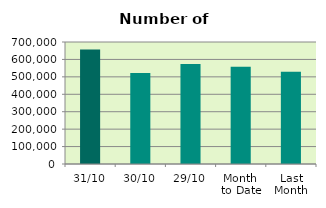
| Category | Series 0 |
|---|---|
| 31/10 | 656512 |
| 30/10 | 522778 |
| 29/10 | 573670 |
| Month 
to Date | 558199.478 |
| Last
Month | 529677.905 |